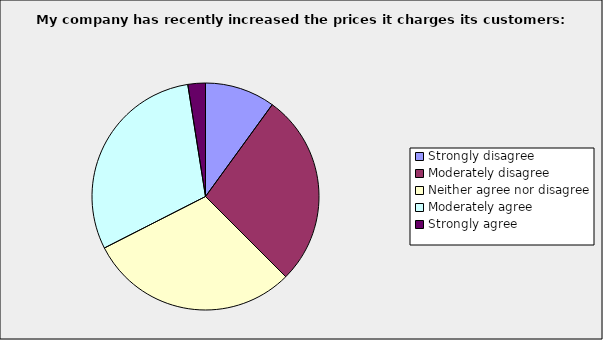
| Category | Series 0 |
|---|---|
| Strongly disagree | 0.1 |
| Moderately disagree | 0.275 |
| Neither agree nor disagree | 0.3 |
| Moderately agree | 0.3 |
| Strongly agree | 0.025 |